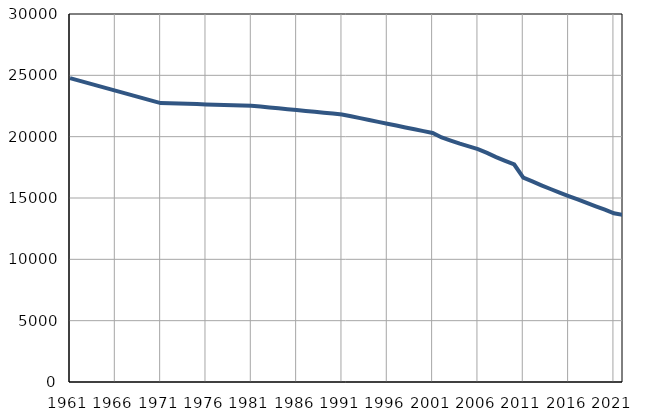
| Category | Број
становника |
|---|---|
| 1961.0 | 24770 |
| 1962.0 | 24567 |
| 1963.0 | 24364 |
| 1964.0 | 24161 |
| 1965.0 | 23958 |
| 1966.0 | 23755 |
| 1967.0 | 23552 |
| 1968.0 | 23349 |
| 1969.0 | 23146 |
| 1970.0 | 22943 |
| 1971.0 | 22740 |
| 1972.0 | 22718 |
| 1973.0 | 22697 |
| 1974.0 | 22675 |
| 1975.0 | 22653 |
| 1976.0 | 22632 |
| 1977.0 | 22610 |
| 1978.0 | 22588 |
| 1979.0 | 22566 |
| 1980.0 | 22545 |
| 1981.0 | 22523 |
| 1982.0 | 22452 |
| 1983.0 | 22381 |
| 1984.0 | 22311 |
| 1985.0 | 22239 |
| 1986.0 | 22167 |
| 1987.0 | 22096 |
| 1988.0 | 22025 |
| 1989.0 | 21954 |
| 1990.0 | 21883 |
| 1991.0 | 21812 |
| 1992.0 | 21661 |
| 1993.0 | 21510 |
| 1994.0 | 21358 |
| 1995.0 | 21207 |
| 1996.0 | 21056 |
| 1997.0 | 20905 |
| 1998.0 | 20754 |
| 1999.0 | 20603 |
| 2000.0 | 20451 |
| 2001.0 | 20300 |
| 2002.0 | 19934 |
| 2003.0 | 19684 |
| 2004.0 | 19428 |
| 2005.0 | 19213 |
| 2006.0 | 18983 |
| 2007.0 | 18678 |
| 2008.0 | 18333 |
| 2009.0 | 18023 |
| 2010.0 | 17731 |
| 2011.0 | 16659 |
| 2012.0 | 16349 |
| 2013.0 | 16035 |
| 2014.0 | 15732 |
| 2015.0 | 15444 |
| 2016.0 | 15158 |
| 2017.0 | 14883 |
| 2018.0 | 14595 |
| 2019.0 | 14319 |
| 2020.0 | 14054 |
| 2021.0 | 13749 |
| 2022.0 | 13626 |